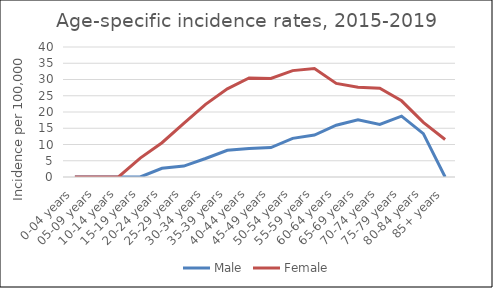
| Category | Male | Female |
|---|---|---|
| 0-04 years | 0 | 0 |
| 05-09 years | 0 | 0 |
| 10-14 years | 0 | 0 |
| 15-19 years | 0 | 5.82 |
| 20-24 years | 2.67 | 10.55 |
| 25-29 years | 3.35 | 16.51 |
| 30-34 years | 5.69 | 22.36 |
| 35-39 years | 8.22 | 27.11 |
| 40-44 years | 8.74 | 30.46 |
| 45-49 years | 9.04 | 30.3 |
| 50-54 years | 11.89 | 32.73 |
| 55-59 years | 12.92 | 33.38 |
| 60-64 years | 15.93 | 28.79 |
| 65-69 years | 17.57 | 27.62 |
| 70-74 years | 16.18 | 27.31 |
| 75-79 years | 18.71 | 23.44 |
| 80-84 years | 13.34 | 16.8 |
| 85+ years | 0 | 11.53 |